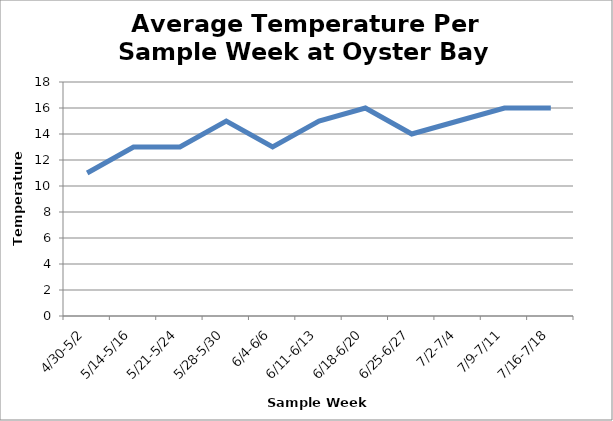
| Category | Oyster |
|---|---|
| 4/30-5/2 | 11 |
| 5/14-5/16 | 13 |
| 5/21-5/24 | 13 |
| 5/28-5/30 | 15 |
| 6/4-6/6 | 13 |
| 6/11-6/13 | 15 |
| 6/18-6/20 | 16 |
| 6/25-6/27 | 14 |
| 7/2-7/4 | 15 |
| 7/9-7/11 | 16 |
| 7/16-7/18 | 16 |